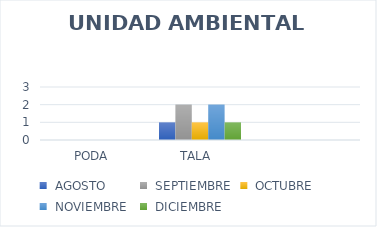
| Category | Series 0 | Series 2 | Series 3 | Series 4 | Series 5 |
|---|---|---|---|---|---|
| PODA | 0 | 0 | 0 | 0 | 0 |
| TALA  | 1 | 2 | 1 | 2 | 1 |